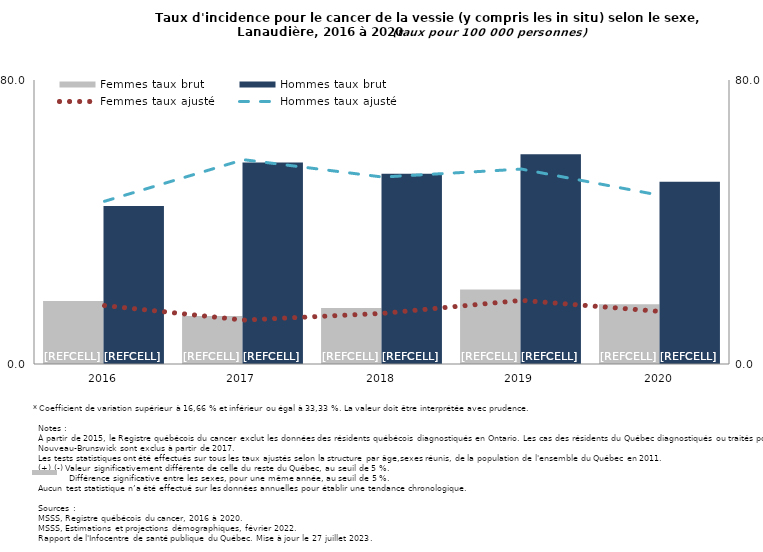
| Category | Femmes taux brut | Hommes taux brut |
|---|---|---|
| 2016.0 | 17.738 | 44.536 |
| 2017.0 | 13.55 | 56.732 |
| 2018.0 | 15.785 | 53.609 |
| 2019.0 | 21.019 | 59.116 |
| 2020.0 | 16.836 | 51.31 |